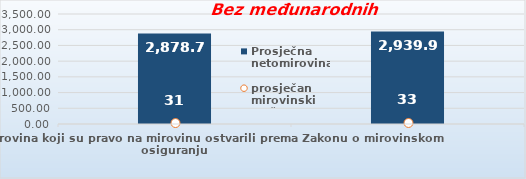
| Category | Prosječna netomirovina  |
|---|---|
| Korisnici mirovina koji su pravo na mirovinu ostvarili prema Zakonu o mirovinskom osiguranju  | 2878.72 |
| Korisnici koji su pravo na mirovinu PRVI PUT ostvarili u 2020. godini prema Zakonu o mirovinskom osiguranju - NOVI KORISNICI | 2939.948 |